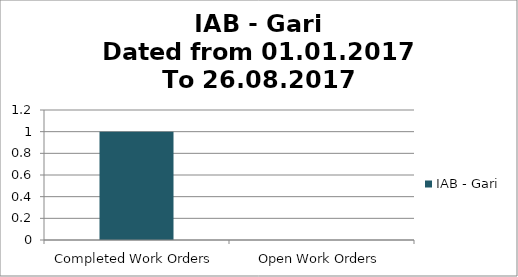
| Category | IAB - Gari |
|---|---|
| Completed Work Orders | 1 |
| Open Work Orders | 0 |